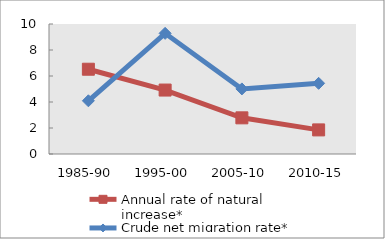
| Category | Annual rate of natural increase* | Crude net migration rate* |
|---|---|---|
| 1985-90 | 6.521 | 4.093 |
| 1995-00 | 4.919 | 9.281 |
| 2005-10 | 2.782 | 5.007 |
| 2010-15 | 1.854 | 5.436 |